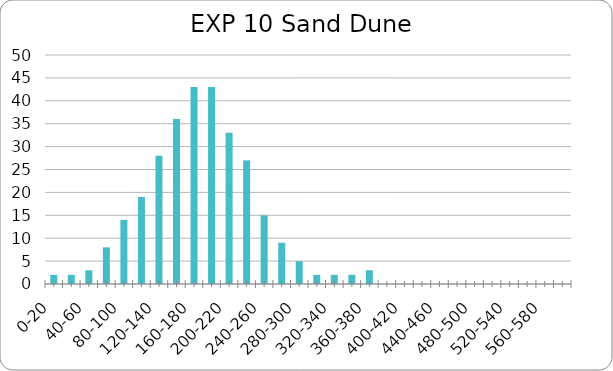
| Category | Series 0 |
|---|---|
| 0-20 | 2 |
| 20-40 | 2 |
| 40-60 | 3 |
| 60-80 | 8 |
| 80-100 | 14 |
| 100-120 | 19 |
| 120-140 | 28 |
| 140-160 | 36 |
| 160-180 | 43 |
| 180-200 | 43 |
| 200-220 | 33 |
| 220-240 | 27 |
| 240-260 | 15 |
| 260-280 | 9 |
| 280-300 | 5 |
| 300-320 | 2 |
| 320-340 | 2 |
| 340-360 | 2 |
| 360-380 | 3 |
| 380-400 | 0 |
| 400-420 | 0 |
| 420-440 | 0 |
| 440-460 | 0 |
| 460-480 | 0 |
| 480-500 | 0 |
| 500-520 | 0 |
| 520-540 | 0 |
| 540-560 | 0 |
| 560-580 | 0 |
| 580-600 | 0 |